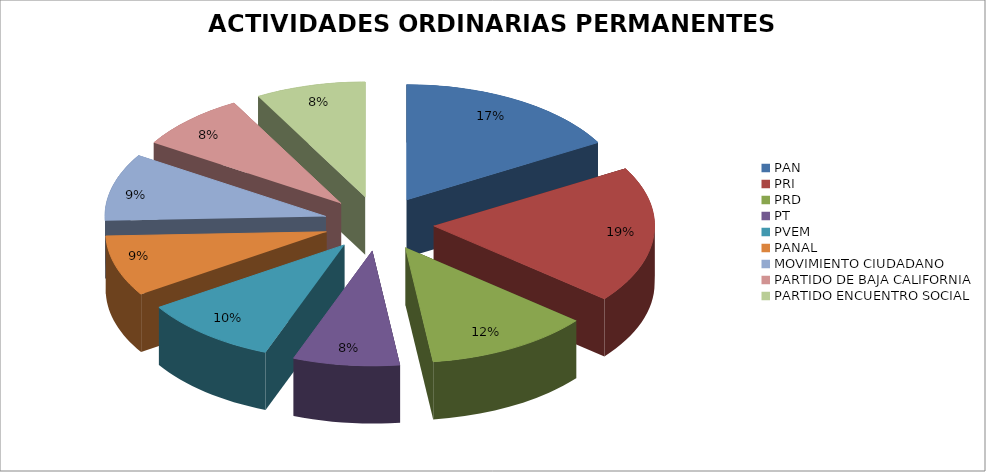
| Category | Series 0 |
|---|---|
| PAN | 2652262.43 |
| PRI | 3058033.73 |
| PRD | 1915169.1 |
| PT | 1240005.78 |
| PVEM | 1597444.67 |
| PANAL | 1359157.92 |
| MOVIMIENTO CIUDADANO | 1504689.93 |
| PARTIDO DE BAJA CALIFORNIA | 1279720.24 |
| PARTIDO ENCUENTRO SOCIAL | 1279720.24 |